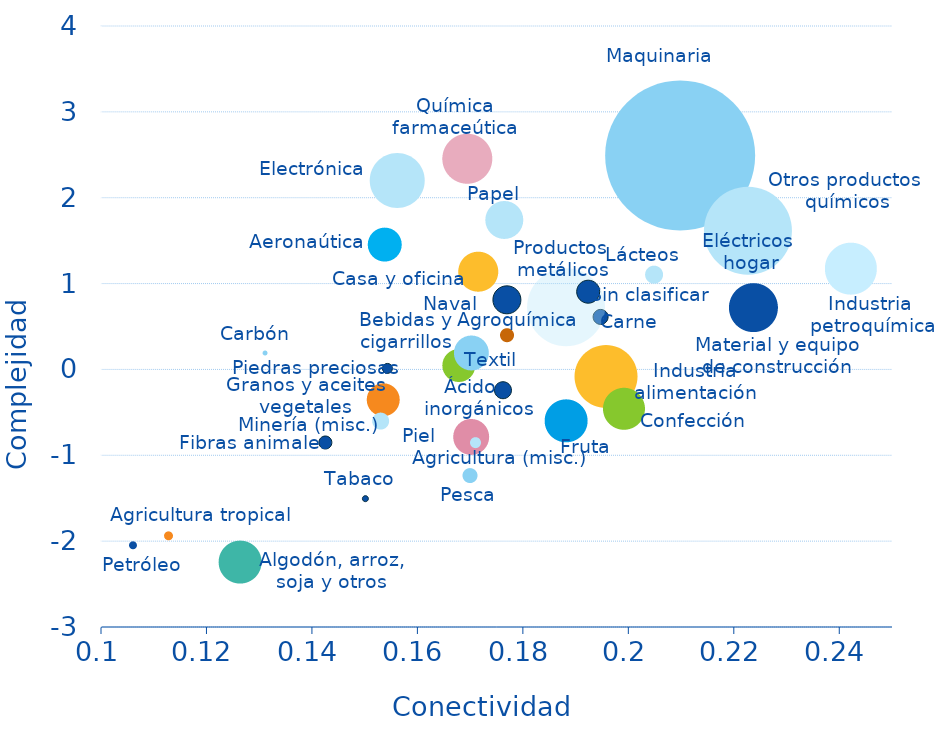
| Category | Series 0 |
|---|---|
| 0.176957 | 0.401 |
| 0.153739 | 1.458 |
| 0.142522 | -0.849 |
| 0.167826 | 0.047 |
| 0.218957 | 1.511 |
| 0.153478 | -0.35 |
| 0.169391 | 2.458 |
| 0.131043 | 0.195 |
| 0.223652 | 0.724 |
| 0.126348 | -2.242 |
| 0.156087 | 2.206 |
| 0.169913 | -1.232 |
| 0.195739 | -0.08 |
| 0.188174 | -0.597 |
| 0.19913 | -0.456 |
| 0.171478 | 1.142 |
| 0.176174 | -0.239 |
| 0.170174 | -0.785 |
| 0.209826 | 2.492 |
| 0.194696 | 0.614 |
| 0.188174 | 0.726 |
| 0.20487 | 1.105 |
| 0.152957 | -0.597 |
| 0.170957 | -0.849 |
| 0.192348 | 0.907 |
| 0.106 | -2.044 |
| 0.222609 | 1.62 |
| 0.242174 | 1.175 |
| 0.154261 | 0.015 |
| 0.176435 | 1.744 |
| 0.176957 | 0.812 |
| 0.170174 | 0.195 |
| 0.150101 | -1.503 |
| 0.112783 | -1.937 |